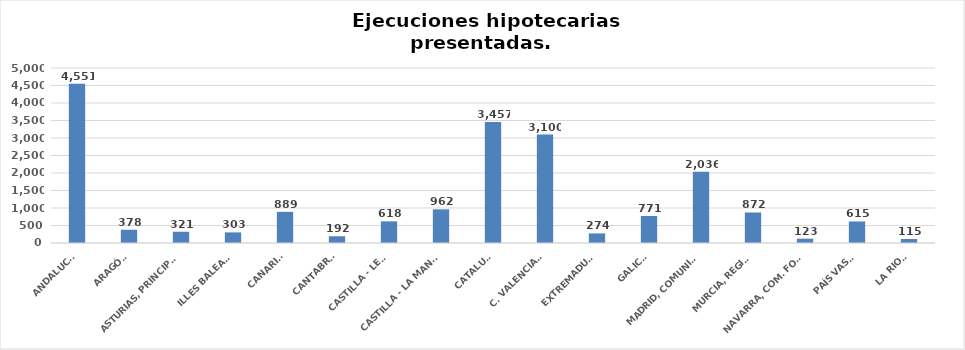
| Category | Series 0 |
|---|---|
| ANDALUCÍA | 4551 |
| ARAGÓN | 378 |
| ASTURIAS, PRINCIPADO | 321 |
| ILLES BALEARS | 303 |
| CANARIAS | 889 |
| CANTABRIA | 192 |
| CASTILLA - LEÓN | 618 |
| CASTILLA - LA MANCHA | 962 |
| CATALUÑA | 3457 |
| C. VALENCIANA | 3100 |
| EXTREMADURA | 274 |
| GALICIA | 771 |
| MADRID, COMUNIDAD | 2036 |
| MURCIA, REGIÓN | 872 |
| NAVARRA, COM. FORAL | 123 |
| PAÍS VASCO | 615 |
| LA RIOJA | 115 |